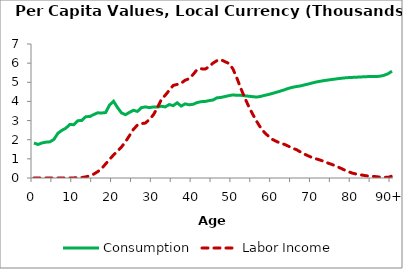
| Category | Consumption | Labor Income |
|---|---|---|
| 0 | 1829.519 | 0 |
|  | 1751.073 | 0 |
| 2 | 1829.659 | 0 |
| 3 | 1871.878 | 0 |
| 4 | 1888.684 | 0 |
| 5 | 2013.21 | 0 |
| 6 | 2334.047 | 0.058 |
| 7 | 2487.758 | 0.18 |
| 8 | 2601.098 | 0.779 |
| 9 | 2792.709 | 2.878 |
| 10 | 2785.908 | 5.735 |
| 11 | 2995.846 | 11.392 |
| 12 | 2999.275 | 25.912 |
| 13 | 3202.842 | 57.817 |
| 14 | 3209.664 | 114.877 |
| 15 | 3314.345 | 202.168 |
| 16 | 3404.09 | 328.808 |
| 17 | 3396.474 | 494.283 |
| 18 | 3416.918 | 732.511 |
| 19 | 3813.037 | 975.935 |
| 20 | 4008.786 | 1202.986 |
| 21 | 3678.315 | 1407.92 |
| 22 | 3399.213 | 1621.245 |
| 23 | 3307.656 | 1893.862 |
| 24 | 3428.196 | 2213.932 |
| 25 | 3539.121 | 2540.477 |
| 26 | 3477.69 | 2766.687 |
| 27 | 3672.649 | 2840.042 |
| 28 | 3715.615 | 2869.206 |
| 29 | 3675.131 | 3055.208 |
| 30 | 3710.951 | 3296.892 |
| 31 | 3703.052 | 3660.125 |
| 32 | 3749.838 | 4093.761 |
| 33 | 3715.091 | 4325.139 |
| 34 | 3837.991 | 4578.765 |
| 35 | 3780.489 | 4835.257 |
| 36 | 3929.885 | 4888.663 |
| 37 | 3755.168 | 4953.083 |
| 38 | 3871.715 | 5107.401 |
| 39 | 3824.969 | 5188.346 |
| 40 | 3849.93 | 5406.454 |
| 41 | 3940.417 | 5665.421 |
| 42 | 3987.061 | 5704.691 |
| 43 | 3998.275 | 5688.566 |
| 44 | 4041.407 | 5807.952 |
| 45 | 4073.914 | 6002.132 |
| 46 | 4189.356 | 6130.449 |
| 47 | 4207.627 | 6178.19 |
| 48 | 4255.658 | 6078.114 |
| 49 | 4301.548 | 5983.955 |
| 50 | 4340.406 | 5703.725 |
| 51 | 4320.57 | 5220.856 |
| 52 | 4319.444 | 4680.671 |
| 53 | 4294.953 | 4179.679 |
| 54 | 4271.976 | 3727.977 |
| 55 | 4247.244 | 3323.732 |
| 56 | 4228.603 | 2949.098 |
| 57 | 4263.091 | 2619.347 |
| 58 | 4319.609 | 2362.363 |
| 59 | 4363.813 | 2170.314 |
| 60 | 4421.811 | 2007.111 |
| 61 | 4483.367 | 1905.44 |
| 62 | 4543.284 | 1814.033 |
| 63 | 4610.639 | 1754.017 |
| 64 | 4684.89 | 1656.902 |
| 65 | 4737.936 | 1557.258 |
| 66 | 4778.663 | 1479.614 |
| 67 | 4810.548 | 1358.416 |
| 68 | 4864.506 | 1245.456 |
| 69 | 4911.042 | 1151.742 |
| 70 | 4967.366 | 1059.589 |
| 71 | 5016.937 | 997.334 |
| 72 | 5055.067 | 931.799 |
| 73 | 5090.32 | 854.468 |
| 74 | 5120.332 | 772.402 |
| 75 | 5149.24 | 699.001 |
| 76 | 5177.41 | 614.071 |
| 77 | 5204.197 | 520.494 |
| 78 | 5227.152 | 424.464 |
| 79 | 5244.477 | 333.178 |
| 80 | 5254.847 | 255.793 |
| 81 | 5265.763 | 206.923 |
| 82 | 5276.395 | 169.443 |
| 83 | 5287.98 | 134.087 |
| 84 | 5297.698 | 101.911 |
| 85 | 5296.829 | 89.913 |
| 86 | 5298.613 | 69.138 |
| 87 | 5318.642 | 45.423 |
| 88 | 5365.455 | 37.365 |
| 89 | 5445.931 | 32.992 |
| 90+ | 5583.89 | 104.538 |